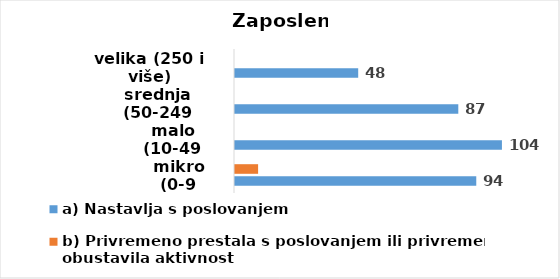
| Category | a) Nastavlja s poslovanjem | b) Privremeno prestala s poslovanjem ili privremeno obustavila aktivnost |
|---|---|---|
| mikro (0-9 uposlenih) | 94 | 9 |
| malo (10-49 uposlenih) | 104 | 0 |
| srednja (50-249 uposlenih) | 87 | 0 |
| velika (250 i više) | 48 | 0 |